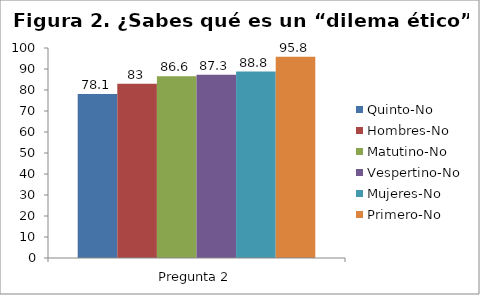
| Category | Quinto-No | Hombres-No | Matutino-No | Vespertino-No | Mujeres-No | Primero-No |
|---|---|---|---|---|---|---|
| 0 | 78.1 | 83 | 86.6 | 87.3 | 88.8 | 95.8 |